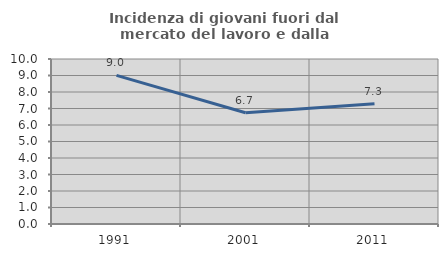
| Category | Incidenza di giovani fuori dal mercato del lavoro e dalla formazione  |
|---|---|
| 1991.0 | 9.009 |
| 2001.0 | 6.742 |
| 2011.0 | 7.292 |